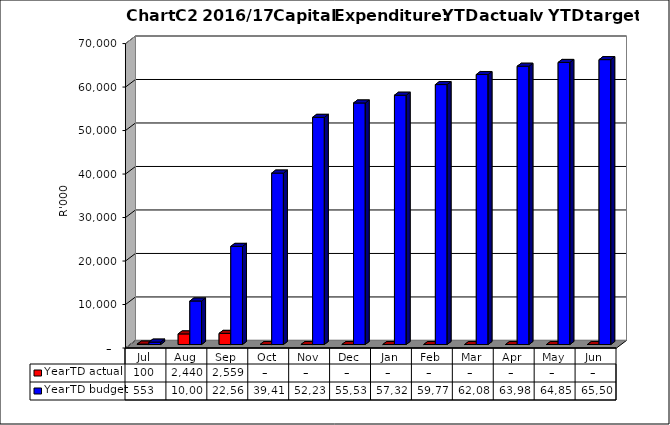
| Category | YearTD actual | YearTD budget |
|---|---|---|
| Jul | 99617 | 553000 |
| Aug | 2439700.45 | 10006416.33 |
| Sep | 2558794.45 | 22565232.66 |
| Oct | 0 | 39418648.993 |
| Nov | 0 | 52232065.323 |
| Dec | 0 | 55536239.153 |
| Jan | 0 | 57319655.483 |
| Feb | 0 | 59773071.809 |
| Mar | 0 | 62081888.139 |
| Apr | 0 | 63985304.466 |
| May | 0 | 64858720.793 |
| Jun | 0 | 65507541.17 |